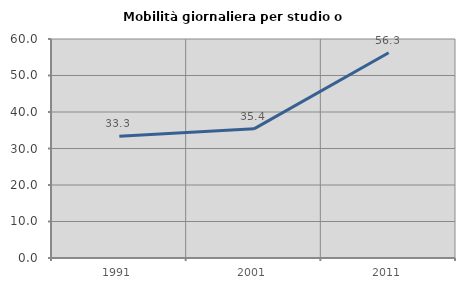
| Category | Mobilità giornaliera per studio o lavoro |
|---|---|
| 1991.0 | 33.333 |
| 2001.0 | 35.385 |
| 2011.0 | 56.25 |